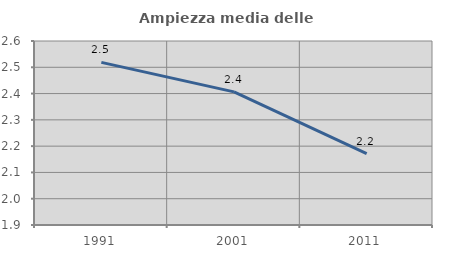
| Category | Ampiezza media delle famiglie |
|---|---|
| 1991.0 | 2.519 |
| 2001.0 | 2.406 |
| 2011.0 | 2.172 |